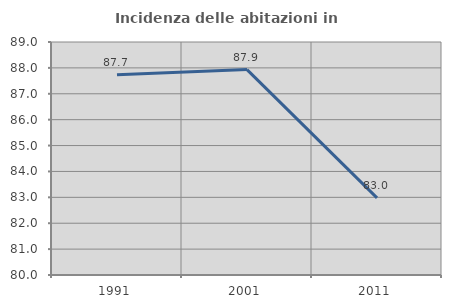
| Category | Incidenza delle abitazioni in proprietà  |
|---|---|
| 1991.0 | 87.73 |
| 2001.0 | 87.933 |
| 2011.0 | 82.979 |